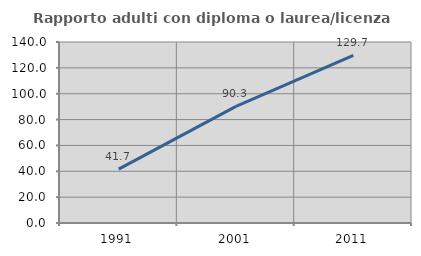
| Category | Rapporto adulti con diploma o laurea/licenza media  |
|---|---|
| 1991.0 | 41.704 |
| 2001.0 | 90.258 |
| 2011.0 | 129.659 |